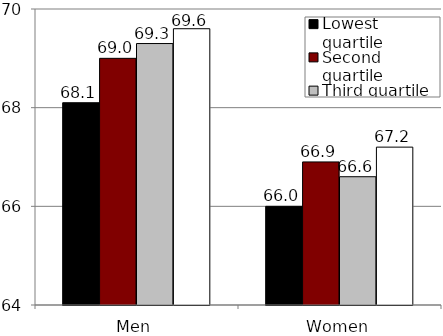
| Category | Lowest quartile | Second quartile | Third quartile | Highest quartile |
|---|---|---|---|---|
| Men | 68.1 | 69 | 69.3 | 69.6 |
| Women | 66 | 66.9 | 66.6 | 67.2 |